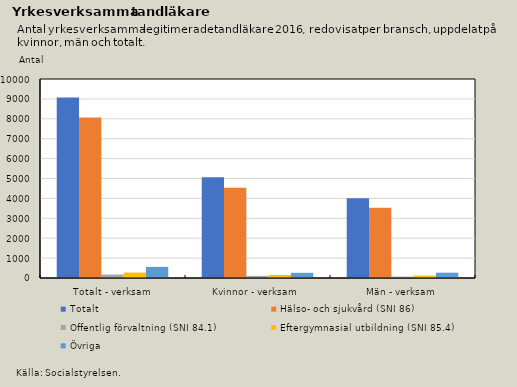
| Category | Totalt | Hälso- och sjukvård (SNI 86) | Offentlig förvaltning (SNI 84.1) | Eftergymnasial utbildning (SNI 85.4) | Övriga |
|---|---|---|---|---|---|
| Totalt - verksam | 9074 | 8063 | 174 | 272 | 557 |
| Kvinnor - verksam | 5069 | 4532 | 105 | 150 | 261 |
| Män - verksam | 4005 | 3531 | 69 | 122 | 267 |